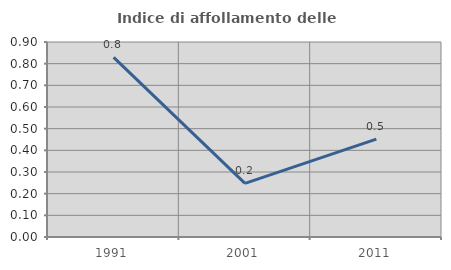
| Category | Indice di affollamento delle abitazioni  |
|---|---|
| 1991.0 | 0.829 |
| 2001.0 | 0.248 |
| 2011.0 | 0.451 |